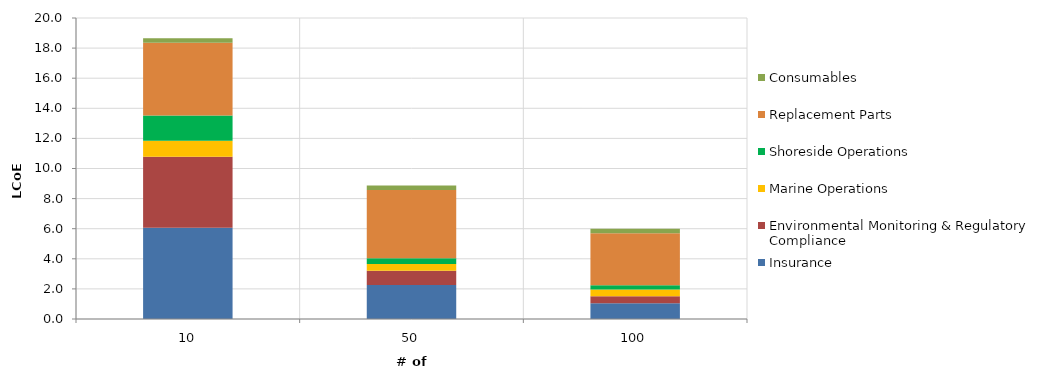
| Category | Insurance | Environmental Monitoring & Regulatory Compliance | Marine Operations | Shoreside Operations | Replacement Parts | Consumables |
|---|---|---|---|---|---|---|
| 10.0 | 6.065 | 4.722 | 1.049 | 1.685 | 4.84 | 0.295 |
| 50.0 | 2.26 | 0.944 | 0.443 | 0.383 | 4.542 | 0.295 |
| 100.0 | 1.043 | 0.472 | 0.443 | 0.284 | 3.462 | 0.295 |